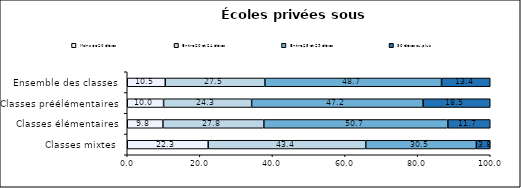
| Category | Moins de 20 élèves | Entre 20 et 24 élèves | Entre 25 et 29 élèves | 30 élèves ou plus |
|---|---|---|---|---|
| Classes mixtes | 22.3 | 43.4 | 30.48 | 3.83 |
| Classes élémentaires | 9.82 | 27.81 | 50.69 | 11.68 |
| Classes préélémentaires | 10.01 | 24.26 | 47.23 | 18.5 |
| Ensemble des classes | 10.48 | 27.45 | 48.65 | 13.42 |